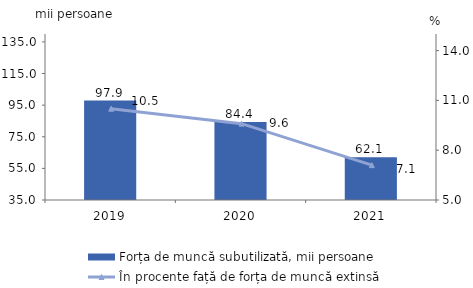
| Category | Forța de muncă subutilizată, mii persoane |
|---|---|
| 2019.0 | 97.9 |
| 2020.0 | 84.4 |
| 2021.0 | 62.1 |